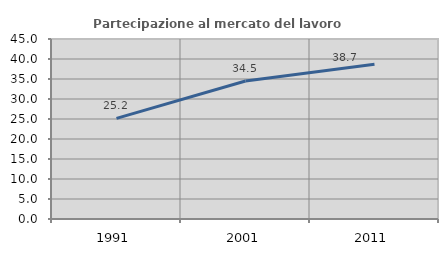
| Category | Partecipazione al mercato del lavoro  femminile |
|---|---|
| 1991.0 | 25.17 |
| 2001.0 | 34.498 |
| 2011.0 | 38.71 |